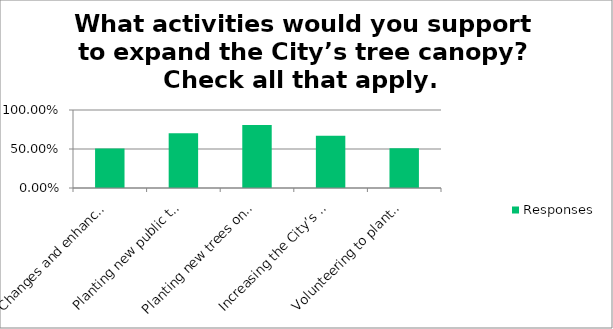
| Category | Responses |
|---|---|
| Changes and enhancements to city tree policies, guidelines, manuals, etc. | 0.506 |
| Planting new public trees adjacent to my property when trees die or need to be removed | 0.701 |
| Planting new trees on City maintained areas such as rights-of- way and parks | 0.807 |
| Increasing the City’s budget for tree planting and maintenance | 0.668 |
| Volunteering to plant and maintain trees on public property | 0.509 |